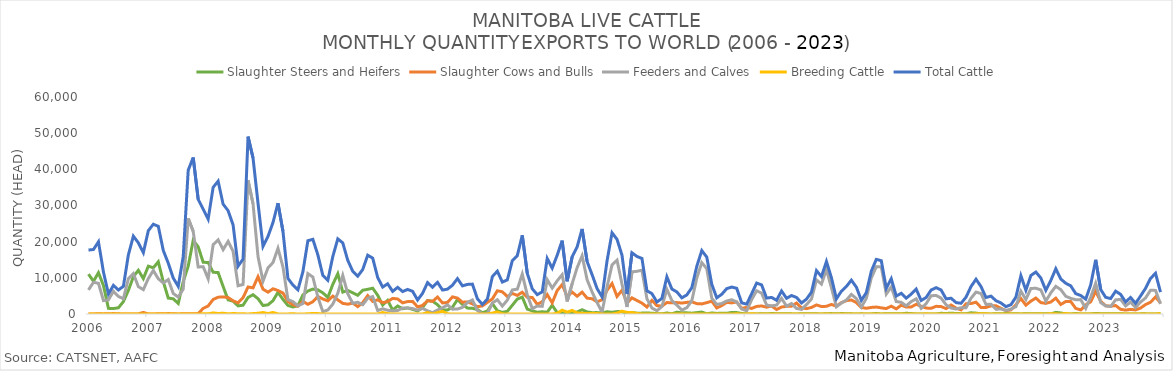
| Category | Slaughter Steers and Heifers | Slaughter Cows and Bulls | Feeders and Calves | Breeding Cattle | Total Cattle |
|---|---|---|---|---|---|
| 2006-01-01 | 11012 | 12 | 6661 | 0 | 17685 |
| 2006-02-01 | 9053 | 22 | 8762 | 0 | 17837 |
| 2006-03-01 | 11426 | 50 | 8493 | 0 | 19969 |
| 2006-04-01 | 7870 | 31 | 3706 | 0 | 11607 |
| 2006-05-01 | 1559 | 66 | 3914 | 0 | 5539 |
| 2006-06-01 | 1517 | 116 | 6281 | 0 | 7914 |
| 2006-07-01 | 1715 | 53 | 4860 | 0 | 6628 |
| 2006-08-01 | 3430 | 0 | 4226 | 0 | 7656 |
| 2006-09-01 | 6531 | 30 | 9804 | 0 | 16365 |
| 2006-10-01 | 10330 | 28 | 11172 | 0 | 21530 |
| 2006-11-01 | 12086 | 34 | 7560 | 0 | 19680 |
| 2006-12-01 | 9790 | 432 | 6739 | 0 | 16961 |
| 2007-01-01 | 13221 | 20 | 9806 | 0 | 23047 |
| 2007-02-01 | 12777 | 18 | 12028 | 0 | 24823 |
| 2007-03-01 | 14447 | 47 | 9751 | 0 | 24245 |
| 2007-04-01 | 8936 | 51 | 8583 | 0 | 17570 |
| 2007-05-01 | 4407 | 118 | 9529 | 0 | 14054 |
| 2007-06-01 | 4197 | 67 | 5667 | 0 | 9931 |
| 2007-07-01 | 2924 | 18 | 4689 | 0 | 7631 |
| 2007-08-01 | 8957 | 56 | 6884 | 0 | 15897 |
| 2007-09-01 | 13246 | 90 | 26436 | 0 | 39772 |
| 2007-10-01 | 20373 | 35 | 22855 | 0 | 43263 |
| 2007-11-01 | 18570 | 124 | 12991 | 0 | 31685 |
| 2007-12-01 | 14310 | 1544 | 13086 | 54 | 28994 |
| 2008-01-01 | 14234 | 2227 | 9728 | 36 | 26225 |
| 2008-02-01 | 11547 | 4011 | 19157 | 307 | 35022 |
| 2008-03-01 | 11453 | 4646 | 20512 | 132 | 36743 |
| 2008-04-01 | 7614 | 4728 | 17791 | 223 | 30356 |
| 2008-05-01 | 3915 | 4556 | 20068 | 41 | 28580 |
| 2008-06-01 | 3547 | 3638 | 17312 | 136 | 24633 |
| 2008-07-01 | 2246 | 3086 | 7814 | 72 | 13218 |
| 2008-08-01 | 2429 | 4526 | 8165 | 61 | 15181 |
| 2008-09-01 | 4574 | 7470 | 36975 | 11 | 49030 |
| 2008-10-01 | 5333 | 7226 | 30465 | 115 | 43139 |
| 2008-11-01 | 4226 | 10312 | 15890 | 191 | 30619 |
| 2008-12-01 | 2339 | 6867 | 9094 | 402 | 18702 |
| 2009-01-01 | 2532 | 6032 | 12756 | 126 | 21446 |
| 2009-02-01 | 3675 | 6977 | 14219 | 412 | 25283 |
| 2009-03-01 | 5982 | 6492 | 18150 | 25 | 30649 |
| 2009-04-01 | 4040 | 5811 | 13024 | 1 | 22876 |
| 2009-05-01 | 2357 | 3473 | 3988 | 28 | 9846 |
| 2009-06-01 | 1944 | 2571 | 3423 | 65 | 8003 |
| 2009-07-01 | 2289 | 2147 | 2252 | 3 | 6691 |
| 2009-08-01 | 5274 | 3492 | 2912 | 8 | 11686 |
| 2009-09-01 | 6360 | 2677 | 11172 | 56 | 20265 |
| 2009-10-01 | 6889 | 3390 | 10212 | 152 | 20643 |
| 2009-11-01 | 6687 | 4861 | 4687 | 114 | 16349 |
| 2009-12-01 | 5860 | 4154 | 638 | 3 | 10655 |
| 2010-01-01 | 4568 | 3629 | 1113 | 21 | 9331 |
| 2010-02-01 | 8199 | 4944 | 2727 | 33 | 15903 |
| 2010-03-01 | 11135 | 3911 | 5731 | 0 | 20777 |
| 2010-04-01 | 6059 | 2935 | 10659 | 4 | 19657 |
| 2010-05-01 | 6524 | 2712 | 5601 | 2 | 14839 |
| 2010-06-01 | 5849 | 3000 | 2945 | 2 | 11796 |
| 2010-07-01 | 5162 | 2052 | 3253 | 0 | 10467 |
| 2010-08-01 | 6571 | 3162 | 2563 | 3 | 12299 |
| 2010-09-01 | 6819 | 5087 | 4349 | 0 | 16255 |
| 2010-10-01 | 7134 | 3495 | 4815 | 3 | 15447 |
| 2010-11-01 | 5185 | 3931 | 977 | 2 | 10095 |
| 2010-12-01 | 2458 | 3131 | 1441 | 408 | 7438 |
| 2011-01-01 | 3788 | 3436 | 1039 | 91 | 8354 |
| 2011-02-01 | 1087 | 4309 | 863 | 0 | 6259 |
| 2011-03-01 | 2207 | 4162 | 963 | 31 | 7363 |
| 2011-04-01 | 1463 | 3082 | 1638 | 27 | 6210 |
| 2011-05-01 | 1675 | 3440 | 1671 | 2 | 6788 |
| 2011-06-01 | 1286 | 3487 | 1506 | 0 | 6279 |
| 2011-07-01 | 827 | 1977 | 1074 | 1 | 3879 |
| 2011-08-01 | 1805 | 2357 | 1549 | 7 | 5718 |
| 2011-09-01 | 3719 | 3683 | 878 | 394 | 8674 |
| 2011-10-01 | 3541 | 3488 | 372 | 0 | 7401 |
| 2011-11-01 | 2583 | 4689 | 1099 | 377 | 8748 |
| 2011-12-01 | 1126 | 3054 | 1718 | 731 | 6629 |
| 2012-01-01 | 1105 | 3199 | 2515 | 53 | 6872 |
| 2012-02-01 | 1887 | 4733 | 1337 | 0 | 7957 |
| 2012-03-01 | 3999 | 4399 | 1380 | 8 | 9786 |
| 2012-04-01 | 2667 | 3253 | 1832 | 24 | 7776 |
| 2012-05-01 | 1633 | 3356 | 3186 | 8 | 8183 |
| 2012-06-01 | 1575 | 2815 | 3874 | 0 | 8264 |
| 2012-07-01 | 1233 | 2010 | 963 | 3 | 4209 |
| 2012-08-01 | 332 | 2241 | 68 | 0 | 2641 |
| 2012-09-01 | 835 | 3213 | 70 | 0 | 4118 |
| 2012-10-01 | 2862 | 4173 | 3050 | 258 | 10343 |
| 2012-11-01 | 902 | 6423 | 3949 | 573 | 11847 |
| 2012-12-01 | 449 | 6138 | 2193 | 45 | 8825 |
| 2013-01-01 | 755 | 4837 | 3839 | 3 | 9434 |
| 2013-02-01 | 2408 | 5684 | 6652 | 0 | 14744 |
| 2013-03-01 | 4128 | 5141 | 6865 | 15 | 16149 |
| 2013-04-01 | 4674 | 6035 | 11030 | 10 | 21749 |
| 2013-05-01 | 1346 | 4640 | 5269 | 0 | 11255 |
| 2013-06-01 | 872 | 4575 | 1515 | 6 | 6968 |
| 2013-07-01 | 494 | 2669 | 2195 | 0 | 5358 |
| 2013-08-01 | 616 | 3390 | 2116 | 0 | 6122 |
| 2013-09-01 | 494 | 5371 | 9494 | 7 | 15366 |
| 2013-10-01 | 2406 | 3096 | 7168 | 0 | 12670 |
| 2013-11-01 | 394 | 6485 | 9180 | 193 | 16252 |
| 2013-12-01 | 235 | 8134 | 10874 | 1062 | 20305 |
| 2014-01-01 | 287 | 4810 | 3458 | 499 | 9054 |
| 2014-02-01 | 383 | 6054 | 8375 | 987 | 15799 |
| 2014-03-01 | 547 | 4908 | 12812 | 280 | 18547 |
| 2014-04-01 | 1177 | 6046 | 16098 | 199 | 23520 |
| 2014-05-01 | 561 | 4384 | 9468 | 94 | 14507 |
| 2014-06-01 | 375 | 4215 | 6097 | 188 | 10875 |
| 2014-07-01 | 383 | 3357 | 3157 | 132 | 7029 |
| 2014-08-01 | 290 | 3932 | 524 | 5 | 4751 |
| 2014-09-01 | 625 | 6545 | 7516 | 4 | 14690 |
| 2014-10-01 | 472 | 8424 | 13568 | 0 | 22464 |
| 2014-11-01 | 663 | 4859 | 14881 | 240 | 20643 |
| 2014-12-01 | 649 | 6580 | 8251 | 779 | 16259 |
| 2015-01-01 | 100 | 3038 | 1936 | 451 | 5525 |
| 2015-02-01 | 378 | 4466 | 11661 | 418 | 16923 |
| 2015-03-01 | 233 | 3728 | 11804 | 137 | 15902 |
| 2015-04-01 | 243 | 3007 | 12102 | 13 | 15365 |
| 2015-05-01 | 277 | 1929 | 4208 | 1 | 6415 |
| 2015-06-01 | 220 | 3754 | 1646 | 15 | 5635 |
| 2015-07-01 | 92 | 2322 | 897 | 2 | 3313 |
| 2015-08-01 | 42 | 2186 | 2071 | 3 | 4302 |
| 2015-09-01 | 288 | 3162 | 6832 | 0 | 10282 |
| 2015-10-01 | 63 | 3105 | 3726 | 6 | 6900 |
| 2015-11-01 | 495 | 3163 | 2445 | 0 | 6103 |
| 2015-12-01 | 332 | 3030 | 1064 | 41 | 4467 |
| 2016-01-01 | 321 | 3209 | 1739 | 4 | 5273 |
| 2016-02-01 | 226 | 3367 | 3682 | 6 | 7281 |
| 2016-03-01 | 379 | 2869 | 9941 | 7 | 13196 |
| 2016-04-01 | 532 | 2787 | 14207 | 13 | 17539 |
| 2016-05-01 | 58 | 3137 | 12538 | 0 | 15733 |
| 2016-06-01 | 283 | 3555 | 4382 | 9 | 8229 |
| 2016-07-01 | 163 | 1671 | 2646 | 0 | 4480 |
| 2016-08-01 | 209 | 2328 | 2902 | 3 | 5442 |
| 2016-09-01 | 189 | 3217 | 3604 | 5 | 7015 |
| 2016-10-01 | 430 | 3071 | 3947 | 0 | 7448 |
| 2016-11-01 | 394 | 3327 | 3326 | 61 | 7108 |
| 2016-12-01 | 138 | 1562 | 1385 | 0 | 3085 |
| 2017-01-01 | 20 | 1824 | 881 | 0 | 2725 |
| 2017-02-01 | 4 | 1546 | 3961 | 90 | 5601 |
| 2017-03-01 | 13 | 2095 | 6438 | 10 | 8556 |
| 2017-04-01 | 63 | 2222 | 5760 | 1 | 8046 |
| 2017-05-01 | 30 | 1888 | 2472 | 10 | 4400 |
| 2017-06-01 | 140 | 2214 | 2218 | 8 | 4580 |
| 2017-07-01 | 80 | 1243 | 2474 | 0 | 3797 |
| 2017-08-01 | 94 | 1938 | 4320 | 9 | 6361 |
| 2017-09-01 | 70 | 2104 | 2166 | 5 | 4345 |
| 2017-10-01 | 38 | 2161 | 2894 | 12 | 5105 |
| 2017-11-01 | 0 | 3036 | 1539 | 0 | 4575 |
| 2017-12-01 | 78 | 1701 | 1272 | 0 | 3051 |
| 2018-01-01 | 35 | 1481 | 2600 | 1 | 4117 |
| 2018-02-01 | 85 | 1816 | 4142 | 0 | 6043 |
| 2018-03-01 | 51 | 2513 | 9426 | 12 | 12002 |
| 2018-04-01 | 0 | 2057 | 8275 | 16 | 10348 |
| 2018-05-01 | 85 | 2123 | 12284 | 36 | 14528 |
| 2018-06-01 | 113 | 2646 | 7268 | 13 | 10040 |
| 2018-07-01 | 43 | 2160 | 1999 | 6 | 4208 |
| 2018-08-01 | 128 | 3142 | 3025 | 3 | 6298 |
| 2018-09-01 | 83 | 3685 | 3858 | 0 | 7626 |
| 2018-10-01 | 44 | 3877 | 5427 | 0 | 9348 |
| 2018-11-01 | 0 | 3164 | 4268 | 0 | 7432 |
| 2018-12-01 | 46 | 1807 | 1914 | 0 | 3767 |
| 2019-01-01 | 0 | 1581 | 4334 | 0 | 5915 |
| 2019-02-01 | 19 | 1818 | 9992 | 0 | 11829 |
| 2019-03-01 | 136 | 1919 | 13034 | 19 | 15108 |
| 2019-04-01 | 0 | 1701 | 13028 | 13 | 14742 |
| 2019-05-01 | 86 | 1502 | 5515 | 0 | 7103 |
| 2019-06-01 | 81 | 2170 | 7494 | 9 | 9754 |
| 2019-07-01 | 86 | 1421 | 3446 | 9 | 4962 |
| 2019-08-01 | 48 | 2439 | 3230 | 0 | 5717 |
| 2019-09-01 | 203 | 1928 | 2255 | 1 | 4387 |
| 2019-10-01 | 108 | 1943 | 3436 | 0 | 5487 |
| 2019-11-01 | 0 | 2683 | 4193 | 0 | 6876 |
| 2019-12-01 | 0 | 2152 | 1582 | 0 | 3734 |
| 2020-01-01 | 0 | 1641 | 2873 | 48 | 4562 |
| 2020-02-01 | 3 | 1582 | 5047 | 0 | 6632 |
| 2020-03-01 | 8 | 2125 | 5129 | 18 | 7280 |
| 2020-04-01 | 190 | 2050 | 4390 | 4 | 6634 |
| 2020-05-01 | 138 | 1493 | 2554 | 0 | 4185 |
| 2020-06-01 | 225 | 2482 | 1658 | 0 | 4365 |
| 2020-07-01 | 137 | 1623 | 1387 | 10 | 3157 |
| 2020-08-01 | 94 | 1145 | 1727 | 0 | 2966 |
| 2020-09-01 | 76 | 2837 | 1744 | 0 | 4657 |
| 2020-10-01 | 333 | 2894 | 4368 | 0 | 7595 |
| 2020-11-01 | 233 | 3269 | 6061 | 52 | 9615 |
| 2020-12-01 | 75 | 1807 | 5657 | 38 | 7577 |
| 2021-01-01 | 45 | 1800 | 2644 | 77 | 4566 |
| 2021-02-01 | 0 | 2250 | 2697 | 0 | 4947 |
| 2021-03-01 | 93 | 2256 | 1301 | 35 | 3685 |
| 2021-04-01 | 47 | 1586 | 1404 | 14 | 3051 |
| 2021-05-01 | 130 | 921 | 976 | 5 | 2032 |
| 2021-06-01 | 87 | 1129 | 1363 | 4 | 2583 |
| 2021-07-01 | 92 | 2557 | 2019 | 0 | 4668 |
| 2021-08-01 | 6 | 4272 | 6307 | 8 | 10593 |
| 2021-09-01 | 108 | 2446 | 4000 | 0 | 6554 |
| 2021-10-01 | 38 | 3562 | 7054 | 0 | 10654 |
| 2021-11-01 | 57 | 4402 | 7129 | 11 | 11599 |
| 2021-12-01 | 93 | 3149 | 6670 | 41 | 9953 |
| 2022-01-01 | 47 | 2932 | 3571 | 2 | 6552 |
| 2022-02-01 | 30 | 3319 | 5847 | 79 | 9275 |
| 2022-03-01 | 445 | 4377 | 7646 | 42 | 12510 |
| 2022-04-01 | 286 | 2633 | 6743 | 8 | 9670 |
| 2022-05-01 | 27 | 3450 | 4896 | 127 | 8500 |
| 2022-06-01 | 10 | 3444 | 4325 | 0 | 7779 |
| 2022-07-01 | 124 | 1546 | 3946 | 13 | 5629 |
| 2022-08-01 | 0 | 1129 | 3980 | 4 | 5113 |
| 2022-09-01 | 33 | 2513 | 1567 | 0 | 4113 |
| 2022-10-01 | 34 | 3363 | 4662 | 0 | 8059 |
| 2022-11-01 | 142 | 6338 | 8488 | 8 | 14976 |
| 2022-12-01 | 85 | 3515 | 3166 | 18 | 6784 |
| 2023-01-01 | 101 | 2290 | 2219 | 0 | 4610 |
| 2023-02-01 | 44 | 2139 | 2089 | 0 | 4272 |
| 2023-03-01 | 44 | 2344 | 3908 | 33 | 6329 |
| 2023-04-01 | 75 | 1288 | 4040 | 15 | 5418 |
| 2023-05-01 | 2 | 1079 | 2251 | 5 | 3337 |
| 2023-06-01 | 2 | 1277 | 3288 | 2 | 4569 |
| 2023-07-01 | 1 | 1131 | 1797 | 7 | 2936 |
| 2023-08-01 | 34 | 1641 | 3309 | 5 | 4989 |
| 2023-09-01 | 36 | 2606 | 4437 | 15 | 7094 |
| 2023-10-01 | 16 | 3263 | 6568 | 1 | 9848 |
| 2023-11-01 | 20 | 4704 | 6522 | 2 | 11248 |
| 2023-12-01 | 60 | 3060 | 2793 | 128 | 6041 |